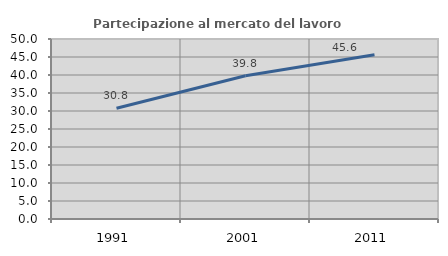
| Category | Partecipazione al mercato del lavoro  femminile |
|---|---|
| 1991.0 | 30.764 |
| 2001.0 | 39.801 |
| 2011.0 | 45.631 |